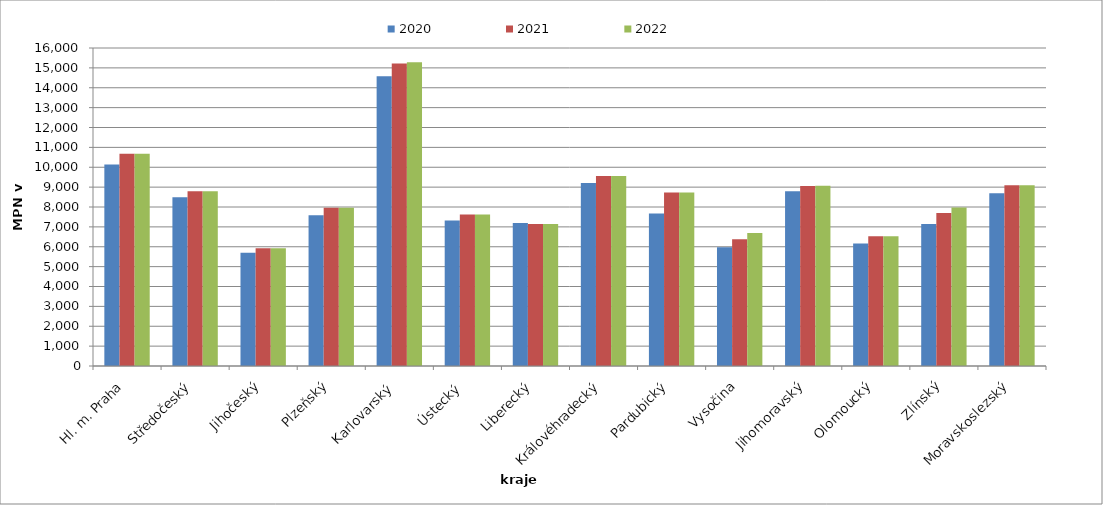
| Category | 2020 | 2021 | 2022 |
|---|---|---|---|
| Hl. m. Praha | 10140.043 | 10675.773 | 10675.773 |
| Středočeský | 8485.2 | 8795.803 | 8795.803 |
| Jihočeský | 5695.028 | 5922.829 | 5922.829 |
| Plzeňský | 7587 | 7966.5 | 7966.5 |
| Karlovarský  | 14580 | 15219.512 | 15278.049 |
| Ústecký   | 7325.064 | 7618.159 | 7618.159 |
| Liberecký | 7195.196 | 7140.111 | 7140.111 |
| Královéhradecký | 9205.72 | 9555.873 | 9555.873 |
| Pardubický | 7676.386 | 8725.301 | 8725.301 |
| Vysočina | 5975.429 | 6371.72 | 6690.087 |
| Jihomoravský | 8788.295 | 9050.656 | 9065.187 |
| Olomoucký | 6159.3 | 6528.9 | 6528.9 |
| Zlínský | 7149.711 | 7699.422 | 7976.879 |
| Moravskoslezský | 8687.415 | 9093.369 | 9093.369 |